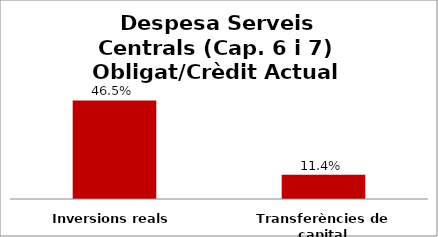
| Category | Series 0 |
|---|---|
| Inversions reals | 0.465 |
| Transferències de capital | 0.114 |